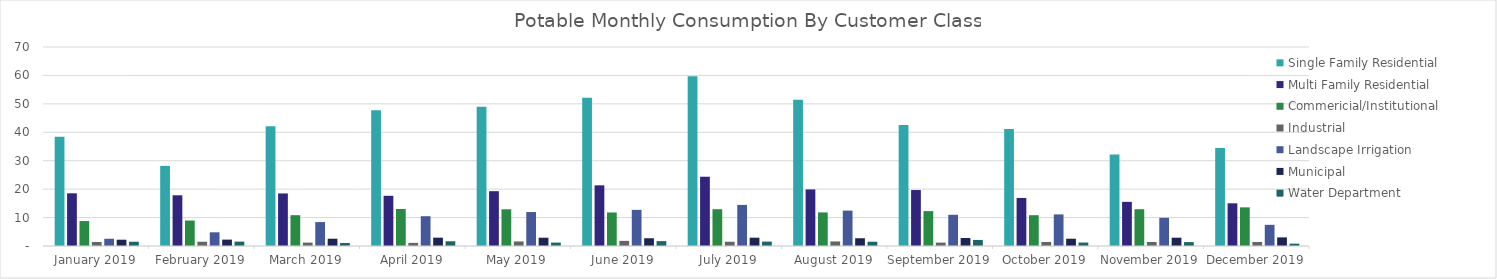
| Category | Single Family Residential | Multi Family Residential | Commericial/Institutional | Industrial | Landscape Irrigation | Municipal | Water Department |
|---|---|---|---|---|---|---|---|
| 2019-01-01 | 38.42 | 18.536 | 8.778 | 1.4 | 2.54 | 2.215 | 1.495 |
| 2019-02-01 | 28.18 | 17.836 | 8.962 | 1.5 | 4.82 | 2.246 | 1.546 |
| 2019-03-01 | 42.15 | 18.487 | 10.836 | 1.2 | 8.42 | 2.563 | 1.05 |
| 2019-04-01 | 47.77 | 17.654 | 13.006 | 1.1 | 10.48 | 2.931 | 1.663 |
| 2019-05-01 | 48.99 | 19.285 | 12.912 | 1.6 | 11.94 | 2.915 | 1.201 |
| 2019-06-01 | 52.18 | 21.336 | 11.798 | 1.8 | 12.71 | 2.726 | 1.714 |
| 2019-07-01 | 59.73 | 24.367 | 12.936 | 1.5 | 14.45 | 2.919 | 1.554 |
| 2019-08-01 | 51.48 | 19.894 | 11.814 | 1.6 | 12.45 | 2.729 | 1.495 |
| 2019-09-01 | 42.54 | 19.684 | 12.278 | 1.2 | 10.98 | 2.807 | 2.134 |
| 2019-10-01 | 41.15 | 16.898 | 10.836 | 1.4 | 11.11 | 2.563 | 1.218 |
| 2019-11-01 | 32.15 | 15.526 | 12.939 | 1.4 | 9.92 | 2.919 | 1.378 |
| 2019-12-01 | 34.45 | 15.015 | 13.594 | 1.4 | 7.45 | 3.03 | 0.823 |